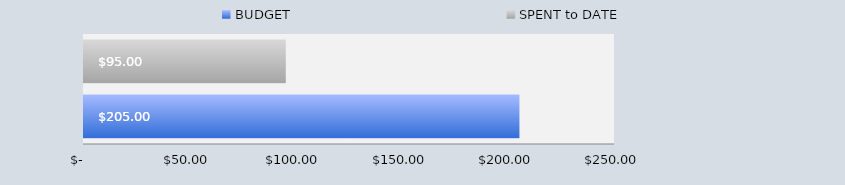
| Category | Series 0 |
|---|---|
| BUDGET | 205 |
| SPENT to DATE | 95 |